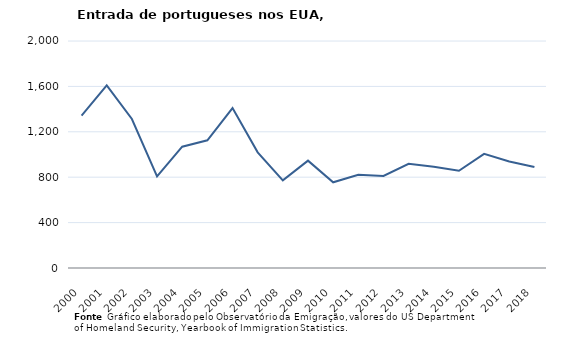
| Category | Entradas de portugueses |
|---|---|
| 2000.0 | 1343 |
| 2001.0 | 1609 |
| 2002.0 | 1313 |
| 2003.0 | 808 |
| 2004.0 | 1069 |
| 2005.0 | 1125 |
| 2006.0 | 1409 |
| 2007.0 | 1019 |
| 2008.0 | 772 |
| 2009.0 | 946 |
| 2010.0 | 755 |
| 2011.0 | 821 |
| 2012.0 | 811 |
| 2013.0 | 918 |
| 2014.0 | 892 |
| 2015.0 | 857 |
| 2016.0 | 1006 |
| 2017.0 | 939 |
| 2018.0 | 889 |